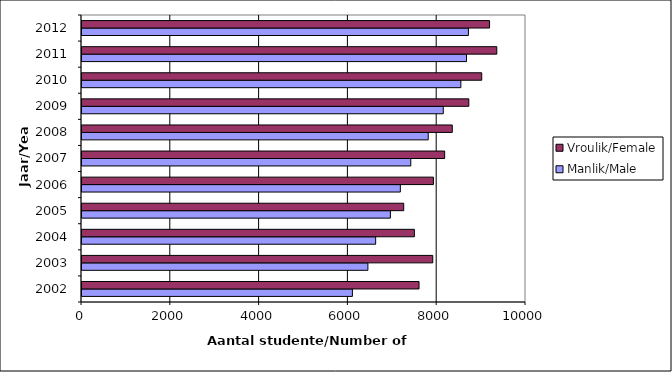
| Category | Manlik/Male | Vroulik/Female |
|---|---|---|
| 2002.0 | 6090 | 7591 |
| 2003.0 | 6439 | 7900 |
| 2004.0 | 6614 | 7486 |
| 2005.0 | 6946 | 7246 |
| 2006.0 | 7170 | 7915 |
| 2007.0 | 7405 | 8168 |
| 2008.0 | 7798 | 8340 |
| 2009.0 | 8137 | 8712 |
| 2010.0 | 8533 | 9003 |
| 2011.0 | 8660 | 9342 |
| 2012.0 | 8703 | 9179 |